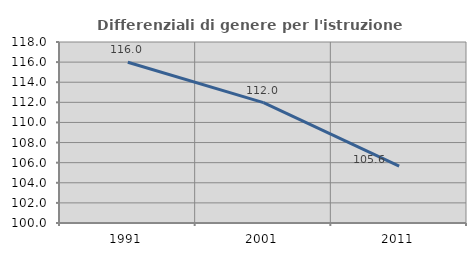
| Category | Differenziali di genere per l'istruzione superiore |
|---|---|
| 1991.0 | 115.98 |
| 2001.0 | 111.966 |
| 2011.0 | 105.647 |